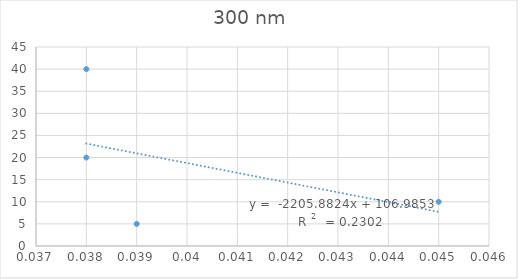
| Category | Series 0 |
|---|---|
| 0.039 | 5 |
| 0.045 | 10 |
| 0.038 | 20 |
| 0.038 | 40 |